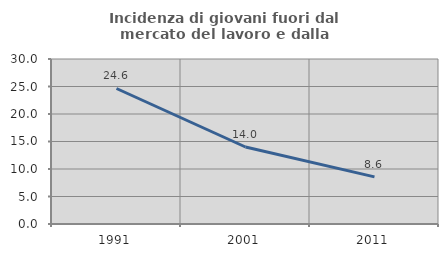
| Category | Incidenza di giovani fuori dal mercato del lavoro e dalla formazione  |
|---|---|
| 1991.0 | 24.638 |
| 2001.0 | 14 |
| 2011.0 | 8.571 |